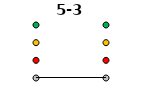
| Category | 0 | 1 | 2 | 3 | 5-3 |
|---|---|---|---|---|---|
| Time 1 | 0 | 1 | 2 | 3 | 0 |
| Time 2 | 0 | 1 | 2 | 3 | 0 |